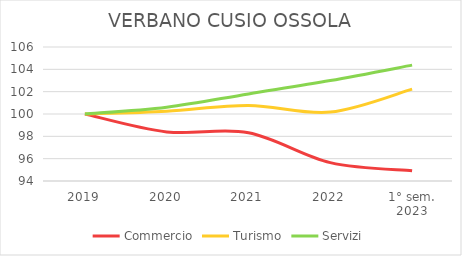
| Category | Commercio | Turismo | Servizi |
|---|---|---|---|
| 2019 | 100 | 100 | 100 |
| 2020 | 98.397 | 100.257 | 100.609 |
| 2021 | 98.322 | 100.771 | 101.8 |
| 2022 | 95.642 | 100.171 | 102.991 |
| 1° sem.
2023 | 94.916 | 102.228 | 104.376 |